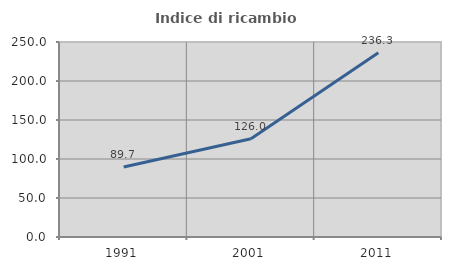
| Category | Indice di ricambio occupazionale  |
|---|---|
| 1991.0 | 89.69 |
| 2001.0 | 126.046 |
| 2011.0 | 236.259 |